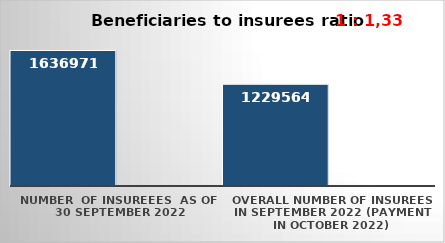
| Category | Series 0 | Series 1 |
|---|---|---|
| NUMBER  of insureees  as of  30 September 2022 | 1636971 |  |
| OVERALL number of insurees in September 2022 (payment in October 2022) | 1229564 |  |